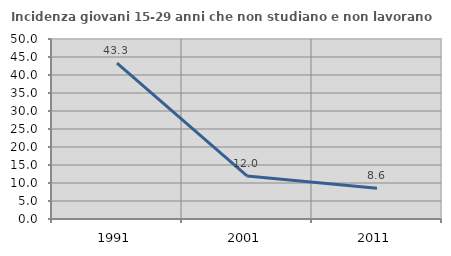
| Category | Incidenza giovani 15-29 anni che non studiano e non lavorano  |
|---|---|
| 1991.0 | 43.284 |
| 2001.0 | 11.957 |
| 2011.0 | 8.553 |